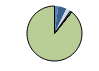
| Category | Series 0 |
|---|---|
| ARRASTRE | 5 |
| CERCO | 11 |
| ATUNEROS CAÑEROS | 0 |
| PALANGRE DE FONDO | 4 |
| PALANGRE DE SUPERFICIE | 2 |
| RASCO | 0 |
| VOLANTA | 2 |
| ARTES FIJAS | 0 |
| ARTES MENORES | 200 |